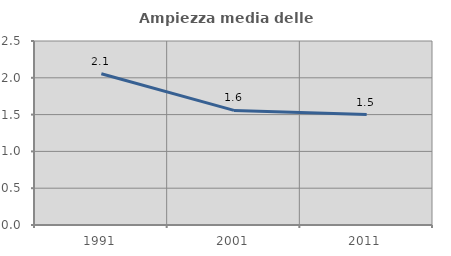
| Category | Ampiezza media delle famiglie |
|---|---|
| 1991.0 | 2.055 |
| 2001.0 | 1.557 |
| 2011.0 | 1.5 |